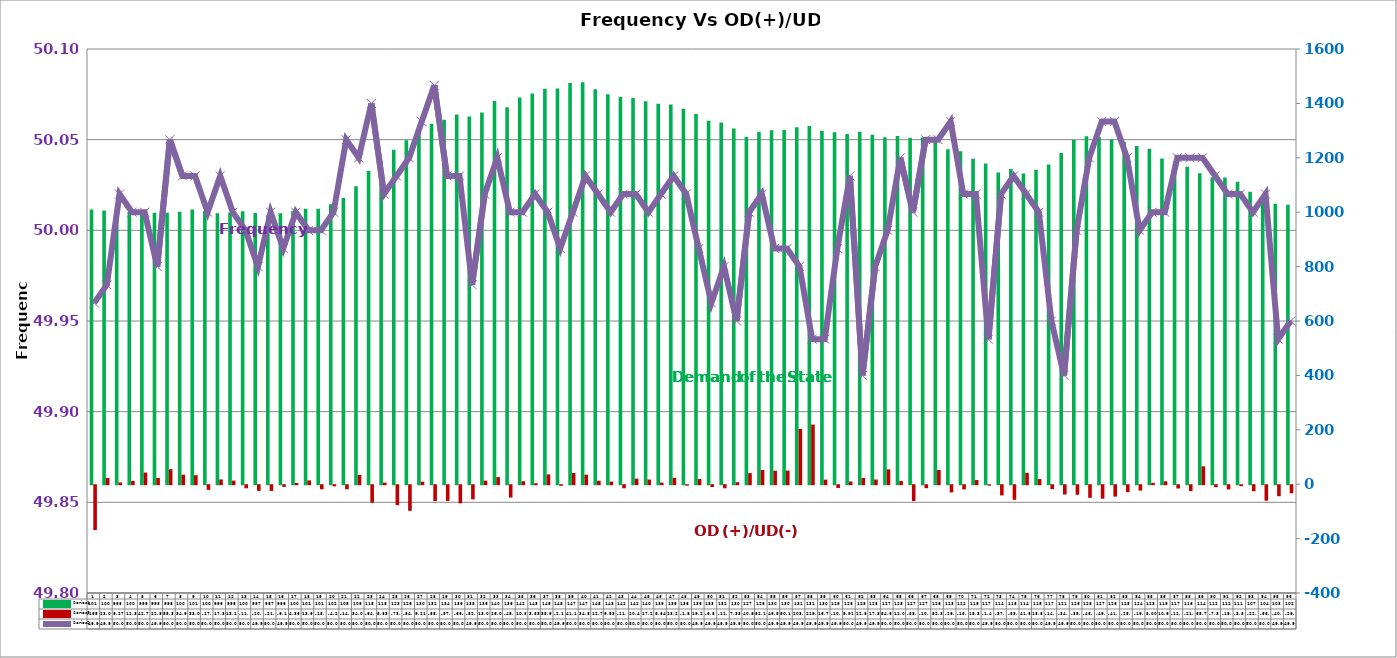
| Category | Series 2 | Series 4 |
|---|---|---|
| 0 | 1009.95 | -165 |
| 1 | 1006.5 | 23.05 |
| 2 | 998.29 | 6.27 |
| 3 | 1000.77 | 12.3 |
| 4 | 999.06 | 42.78 |
| 5 | 997.56 | 22.8 |
| 6 | 998.27 | 55.32 |
| 7 | 1001.35 | 34.98 |
| 8 | 1009.77 | 33.03 |
| 9 | 1004.75 | -17.15 |
| 10 | 996.12 | 17.39 |
| 11 | 998.46 | 13.19 |
| 12 | 1003.28 | -11.43 |
| 13 | 996.78 | -20.92 |
| 14 | 987.25 | -21.07 |
| 15 | 996.1 | -6.15 |
| 16 | 1003.62 | 4.36 |
| 17 | 1012.74 | 13.96 |
| 18 | 1012.77 | -15.03 |
| 19 | 1029.14 | -4.25 |
| 20 | 1051.85 | -14.99 |
| 21 | 1095.68 | 34 |
| 22 | 1151.32 | -64.43 |
| 23 | 1186.9 | 5.83 |
| 24 | 1230.05 | -73.22 |
| 25 | 1264.94 | -94.16 |
| 26 | 1304.86 | 9.21 |
| 27 | 1324.74 | -58.21 |
| 28 | 1340.06 | -57.83 |
| 29 | 1359.56 | -66.63 |
| 30 | 1351.4 | -52.1 |
| 31 | 1366.98 | 13.07 |
| 32 | 1408.67 | 26.07 |
| 33 | 1386.18 | -45.34 |
| 34 | 1421.69 | 10.88 |
| 35 | 1436.79 | 3.53 |
| 36 | 1453.46 | 35.99 |
| 37 | 1454.57 | -2.17 |
| 38 | 1474.82 | 41.17 |
| 39 | 1478.15 | 34.89 |
| 40 | 1452.42 | 12.77 |
| 41 | 1433.31 | 9.53 |
| 42 | 1423.65 | -11.39 |
| 43 | 1419.8 | 20.44 |
| 44 | 1407.93 | 17.23 |
| 45 | 1398.33 | 5.84 |
| 46 | 1395.76 | 23.25 |
| 47 | 1380.27 | -1.88 |
| 48 | 1360.85 | 19.24 |
| 49 | 1336.59 | -6.55 |
| 50 | 1329.44 | -11.4 |
| 51 | 1307.77 | 7.33 |
| 52 | 1276.26 | 40.85 |
| 53 | 1296.04 | 52.16 |
| 54 | 1301.37 | 49.51 |
| 55 | 1302.44 | 50.14 |
| 56 | 1312.58 | 203.41 |
| 57 | 1316.77 | 219.15 |
| 58 | 1299.74 | 16.76 |
| 59 | 1294.07 | -10.21 |
| 60 | 1287.82 | 9.91 |
| 61 | 1295.91 | 22.83 |
| 62 | 1284.88 | 17.34 |
| 63 | 1275.88 | 54.67 |
| 64 | 1280.53 | 12.01 |
| 65 | 1273.35 | -58.33 |
| 66 | 1274.97 | -10.98 |
| 67 | 1266.29 | 52.36 |
| 68 | 1231.16 | -26.54 |
| 69 | 1223.81 | -15.63 |
| 70 | 1196.19 | 15.31 |
| 71 | 1179.38 | -1.46 |
| 72 | 1145.77 | -37.44 |
| 73 | 1158.93 | -53.68 |
| 74 | 1142.05 | 41.81 |
| 75 | 1156.07 | 18.89 |
| 76 | 1175.35 | -14.51 |
| 77 | 1217.22 | -34.19 |
| 78 | 1266.55 | -35.07 |
| 79 | 1279.5 | -46.55 |
| 80 | 1276.11 | -49.54 |
| 81 | 1267.5 | -41.97 |
| 82 | 1258.4 | -25.69 |
| 83 | 1243.35 | -19.84 |
| 84 | 1233.63 | 5 |
| 85 | 1197.09 | 10.62 |
| 86 | 1178.06 | -12.1 |
| 87 | 1167.44 | -21.54 |
| 88 | 1143.07 | 65.79 |
| 89 | 1128.26 | -7.33 |
| 90 | 1127.54 | -15.43 |
| 91 | 1112.11 | -3.5 |
| 92 | 1075.44 | -22.03 |
| 93 | 1044.52 | -56.87 |
| 94 | 1031.46 | -40.63 |
| 95 | 1027.44 | -29.82 |